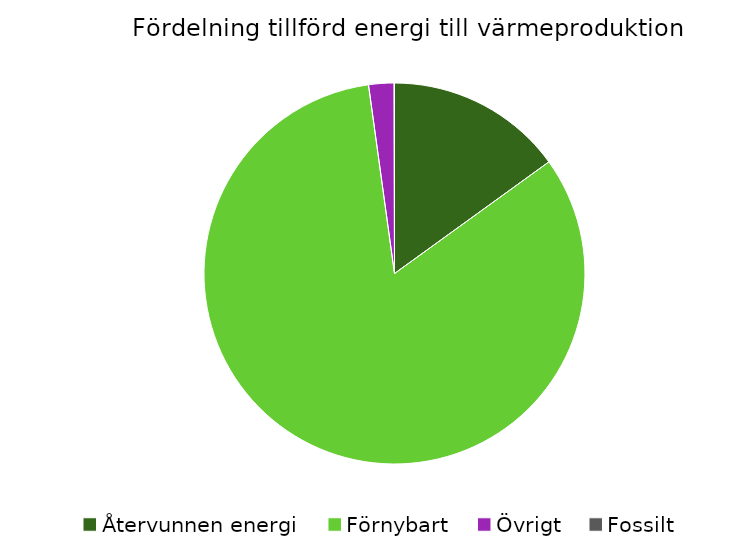
| Category | Fördelning värmeproduktion |
|---|---|
| Återvunnen energi | 0.15 |
| Förnybart | 0.828 |
| Övrigt | 0.021 |
| Fossilt | 0 |